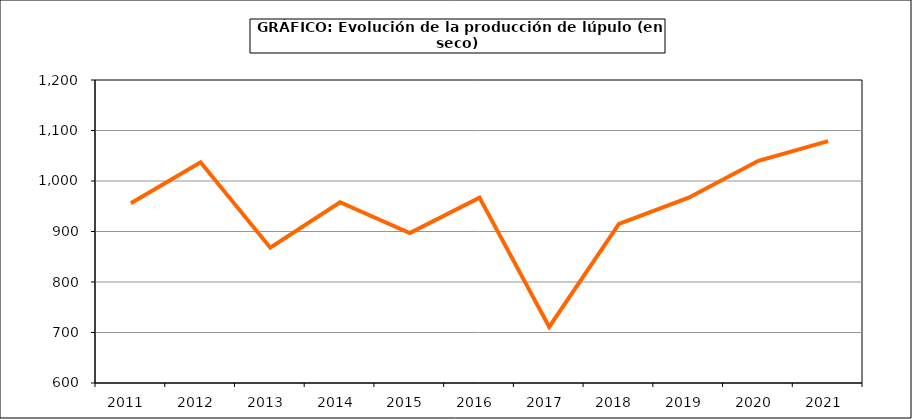
| Category | Superficie |
|---|---|
| 2011.0 | 956 |
| 2012.0 | 1037 |
| 2013.0 | 868 |
| 2014.0 | 958 |
| 2015.0 | 897 |
| 2016.0 | 967 |
| 2017.0 | 711 |
| 2018.0 | 915 |
| 2019.0 | 967 |
| 2020.0 | 1040 |
| 2021.0 | 1079 |